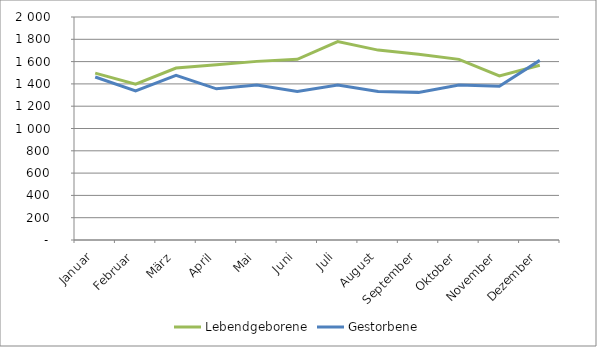
| Category | Lebendgeborene | Gestorbene |
|---|---|---|
| Januar | 1497 | 1462 |
| Februar | 1398 | 1338 |
| März | 1542 | 1477 |
| April | 1572 | 1356 |
| Mai | 1602 | 1389 |
| Juni | 1621 | 1332 |
| Juli | 1779 | 1391 |
| August | 1703 | 1331 |
| September | 1666 | 1324 |
| Oktober | 1620 | 1391 |
| November | 1472 | 1378 |
| Dezember | 1567 | 1611 |